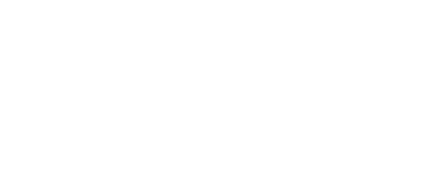
| Category | Series 2 |
|---|---|
| Soma | 0 |
| Energo | 0 |
| Psico | 0 |
| Mental | 0 |
| Extrafísico | 0 |